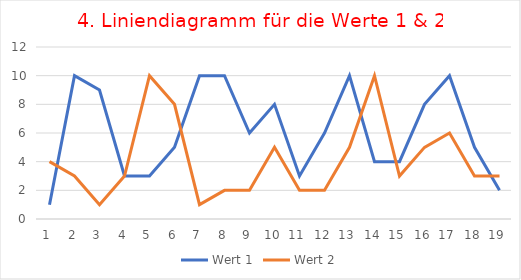
| Category | Wert 1 | Wert 2 |
|---|---|---|
| 0 | 1 | 4 |
| 1 | 10 | 3 |
| 2 | 9 | 1 |
| 3 | 3 | 3 |
| 4 | 3 | 10 |
| 5 | 5 | 8 |
| 6 | 10 | 1 |
| 7 | 10 | 2 |
| 8 | 6 | 2 |
| 9 | 8 | 5 |
| 10 | 3 | 2 |
| 11 | 6 | 2 |
| 12 | 10 | 5 |
| 13 | 4 | 10 |
| 14 | 4 | 3 |
| 15 | 8 | 5 |
| 16 | 10 | 6 |
| 17 | 5 | 3 |
| 18 | 2 | 3 |